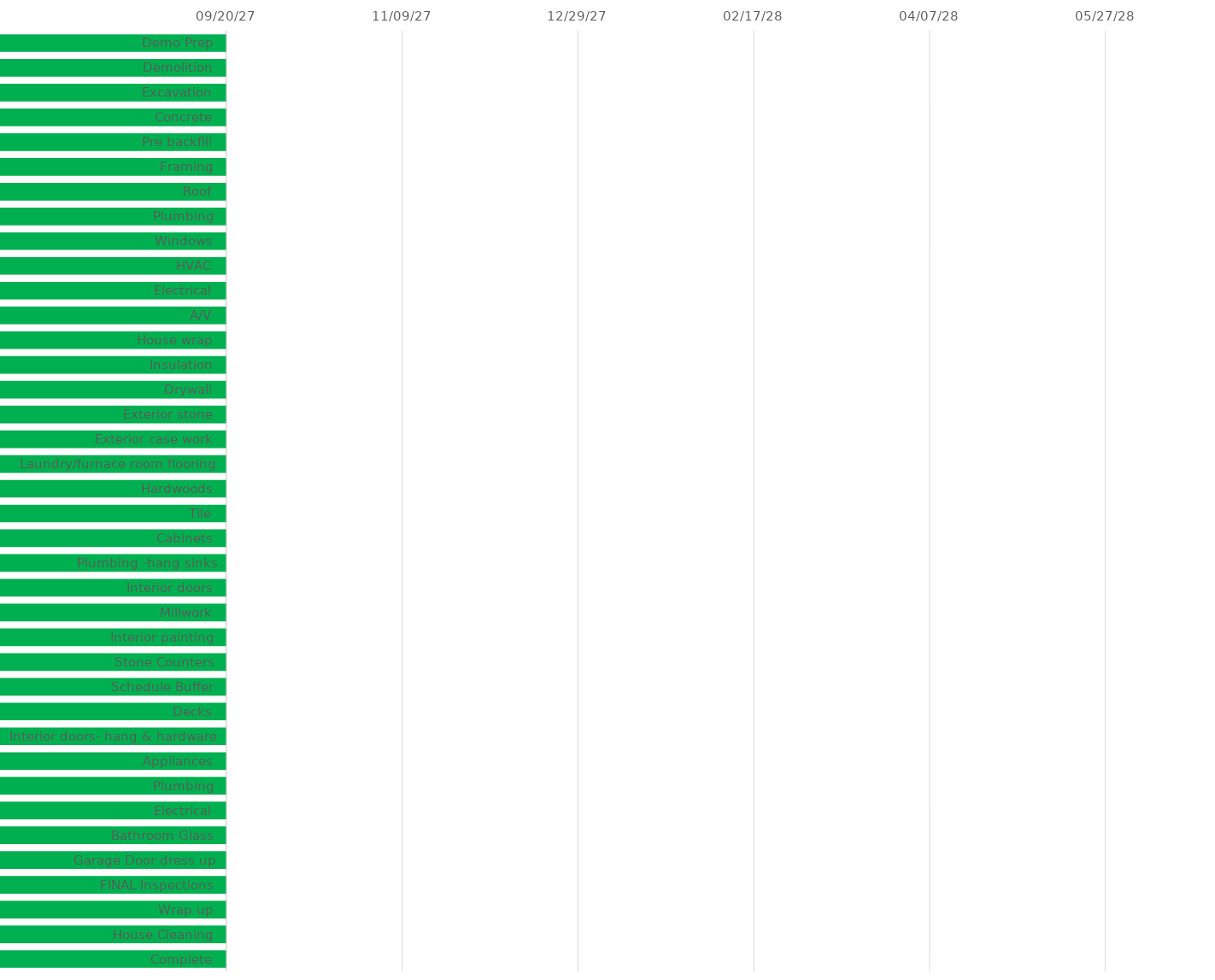
| Category | START 
DATE | Duration |
|---|---|---|
| Demo Prep |  | 1 |
| Demolition |  | 1 |
| Excavation |  | 1 |
| Concrete |  | 1 |
| Pre backfill |  | 1 |
| Framing |  | 1 |
| Roof |  | 1 |
| Plumbing |  | 1 |
| Windows |  | 1 |
| HVAC |  | 1 |
| Electrical |  | 1 |
| A/V |  | 1 |
| House wrap |  | 1 |
| Insulation |  | 1 |
| Drywall |  | 1 |
| Exterior stone |  | 1 |
| Exterior case work |  | 1 |
| Laundry/furnace room flooring |  | 1 |
| Hardwoods |  | 1 |
| Tile |  | 1 |
| Cabinets |  | 1 |
| Plumbing -hang sinks |  | 1 |
| Interior doors |  | 1 |
| Millwork |  | 1 |
| Interior painting |  | 1 |
| Stone Counters |  | 1 |
| Schedule Buffer |  | 1 |
| Decks |  | 1 |
| Interior doors- hang & hardware |  | 1 |
| Appliances |  | 1 |
| Plumbing |  | 1 |
| Electrical |  | 1 |
| Bathroom Glass |  | 1 |
| Garage Door dress up |  | 1 |
| FINAL Inspections |  | 1 |
| Wrap up |  | 1 |
| House Cleaning |  | 1 |
| Complete |  | 1 |